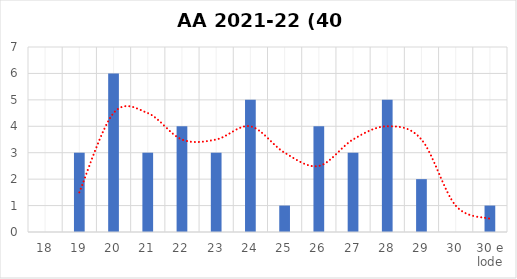
| Category | Series 0 |
|---|---|
| 18 | 0 |
| 19 | 3 |
| 20 | 6 |
| 21 | 3 |
| 22 | 4 |
| 23 | 3 |
| 24 | 5 |
| 25 | 1 |
| 26 | 4 |
| 27 | 3 |
| 28 | 5 |
| 29 | 2 |
| 30 | 0 |
| 30 e lode | 1 |